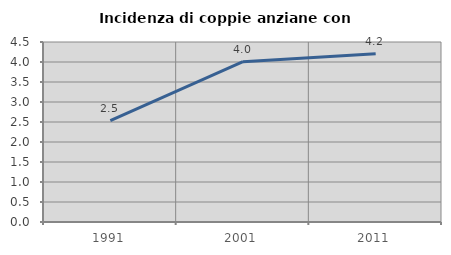
| Category | Incidenza di coppie anziane con figli |
|---|---|
| 1991.0 | 2.532 |
| 2001.0 | 4.008 |
| 2011.0 | 4.208 |